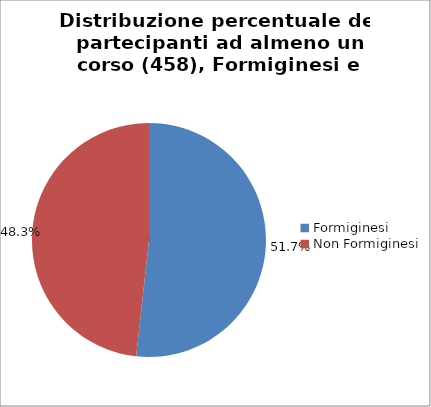
| Category | Nr. Tesserati |
|---|---|
| Formiginesi | 237 |
| Non Formiginesi | 221 |